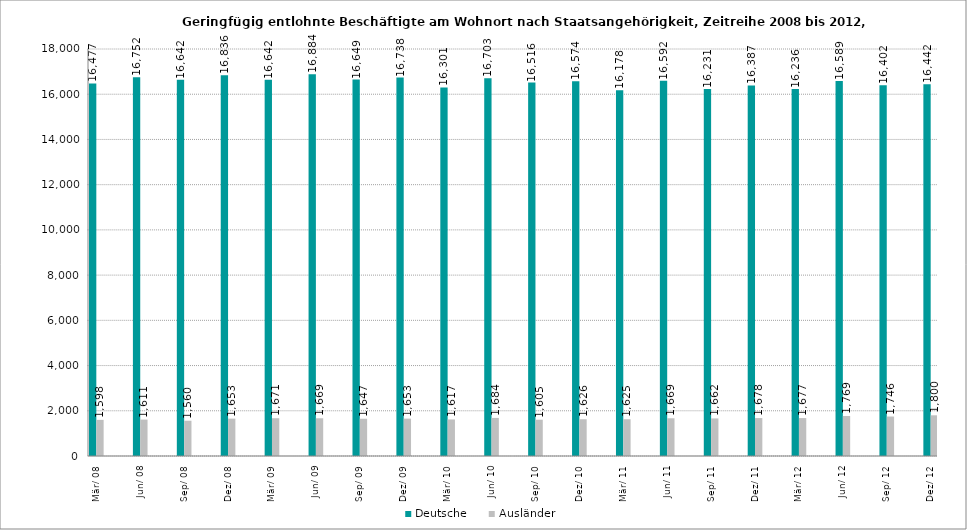
| Category | Deutsche | Ausländer |
|---|---|---|
| 2008-03-31 | 16477 | 1598 |
| 2008-06-30 | 16752 | 1611 |
| 2008-09-30 | 16642 | 1560 |
| 2008-12-31 | 16836 | 1653 |
| 2009-03-31 | 16642 | 1671 |
| 2009-06-30 | 16884 | 1669 |
| 2009-09-30 | 16649 | 1647 |
| 2009-12-31 | 16738 | 1653 |
| 2010-03-31 | 16301 | 1617 |
| 2010-06-30 | 16703 | 1684 |
| 2010-09-30 | 16516 | 1605 |
| 2010-12-31 | 16574 | 1626 |
| 2011-03-31 | 16178 | 1625 |
| 2011-06-30 | 16592 | 1669 |
| 2011-09-30 | 16231 | 1662 |
| 2011-12-31 | 16387 | 1678 |
| 2012-03-31 | 16236 | 1677 |
| 2012-06-30 | 16589 | 1769 |
| 2012-09-30 | 16402 | 1746 |
| 2012-12-31 | 16442 | 1800 |